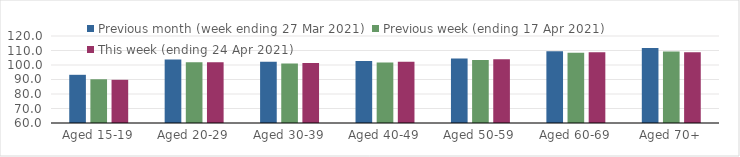
| Category | Previous month (week ending 27 Mar 2021) | Previous week (ending 17 Apr 2021) | This week (ending 24 Apr 2021) |
|---|---|---|---|
| Aged 15-19 | 93.24 | 90.17 | 89.79 |
| Aged 20-29 | 103.75 | 101.96 | 101.82 |
| Aged 30-39 | 102.25 | 101.09 | 101.32 |
| Aged 40-49 | 102.83 | 101.73 | 102.28 |
| Aged 50-59 | 104.41 | 103.52 | 104.05 |
| Aged 60-69 | 109.49 | 108.42 | 108.77 |
| Aged 70+ | 111.67 | 109.32 | 108.74 |